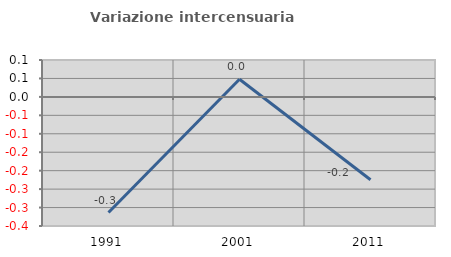
| Category | Variazione intercensuaria annua |
|---|---|
| 1991.0 | -0.314 |
| 2001.0 | 0.048 |
| 2011.0 | -0.224 |